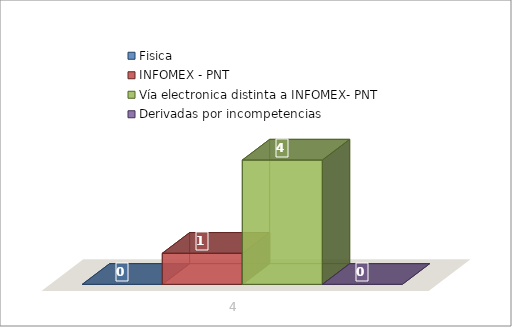
| Category | Fisica | INFOMEX - PNT | Vía electronica distinta a INFOMEX- PNT | Derivadas por incompetencias |
|---|---|---|---|---|
| 0 | 0 | 1 | 4 | 0 |